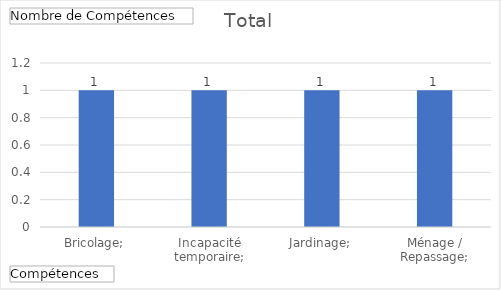
| Category | Total |
|---|---|
| Bricolage; | 1 |
| Incapacité temporaire; | 1 |
| Jardinage; | 1 |
| Ménage / Repassage; | 1 |